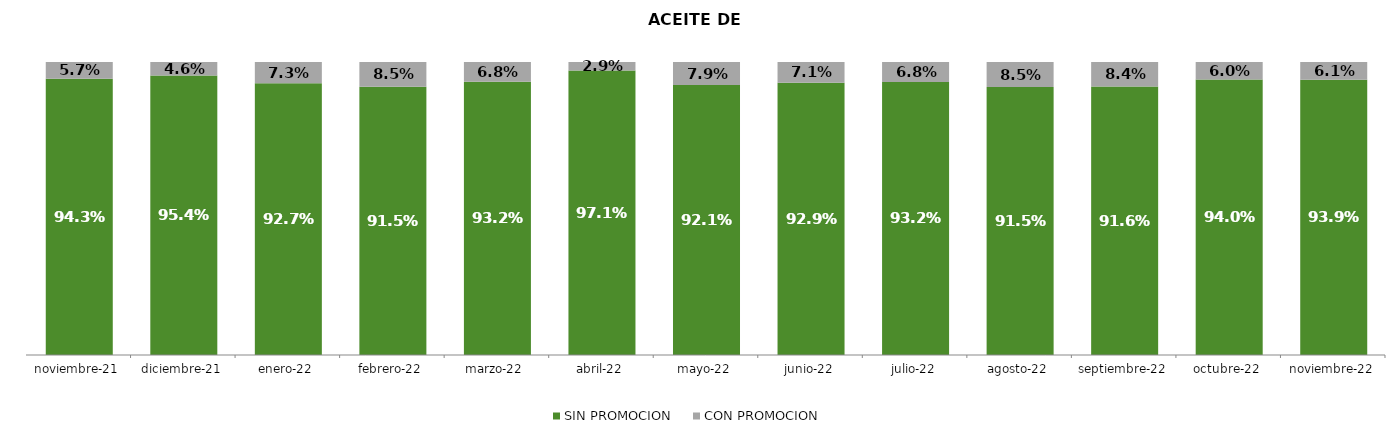
| Category | SIN PROMOCION   | CON PROMOCION   |
|---|---|---|
| 2021-11-01 | 0.943 | 0.057 |
| 2021-12-01 | 0.954 | 0.046 |
| 2022-01-01 | 0.927 | 0.073 |
| 2022-02-01 | 0.915 | 0.085 |
| 2022-03-01 | 0.932 | 0.068 |
| 2022-04-01 | 0.971 | 0.029 |
| 2022-05-01 | 0.921 | 0.079 |
| 2022-06-01 | 0.929 | 0.071 |
| 2022-07-01 | 0.932 | 0.068 |
| 2022-08-01 | 0.915 | 0.085 |
| 2022-09-01 | 0.916 | 0.084 |
| 2022-10-01 | 0.94 | 0.06 |
| 2022-11-01 | 0.939 | 0.061 |